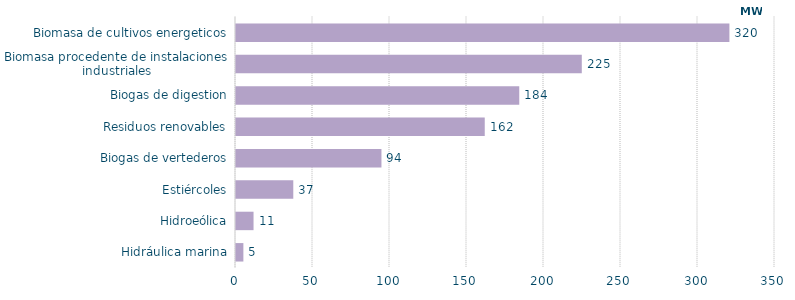
| Category | Series 0 |
|---|---|
| Hidráulica marina | 4.796 |
| Hidroeólica | 11.39 |
| Estiércoles | 37.2 |
| Biogas de vertederos | 94.452 |
| Residuos renovables | 161.526 |
| Biogas de digestion | 183.934 |
| Biomasa procedente de instalaciones industriales | 224.537 |
| Biomasa de cultivos energeticos | 320.397 |